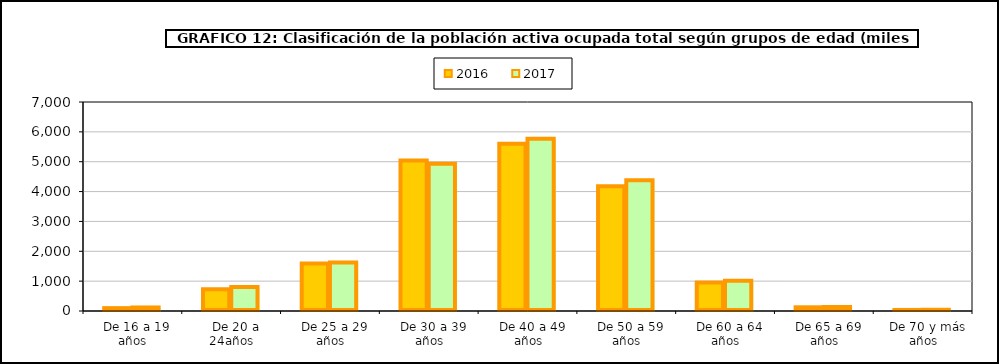
| Category | 2016 | 2017 |
|---|---|---|
|   De 16 a 19 años | 95.8 | 118 |
|   De 20 a 24años | 724.6 | 803.2 |
|   De 25 a 29 años | 1592.6 | 1626.1 |
|   De 30 a 39 años | 5036.9 | 4933.1 |
|   De 40 a 49 años | 5600.9 | 5770.9 |
|   De 50 a 59 años | 4179.1 | 4382.5 |
|   De 60 a 64 años | 952.9 | 1015 |
|   De 65 a 69 años | 123.9 | 134.7 |
|   De 70 y más años | 35.1 | 41.5 |